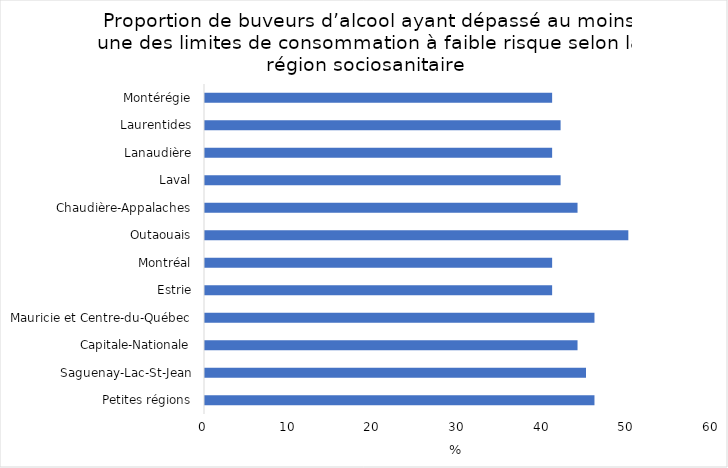
| Category | Series 0 |
|---|---|
| Petites régions | 46 |
| Saguenay-Lac-St-Jean | 45 |
| Capitale-Nationale | 44 |
| Mauricie et Centre-du-Québec | 46 |
| Estrie | 41 |
| Montréal | 41 |
| Outaouais | 50 |
| Chaudière-Appalaches | 44 |
| Laval | 42 |
| Lanaudière | 41 |
| Laurentides | 42 |
| Montérégie | 41 |